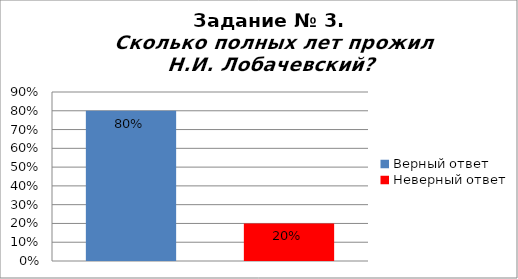
| Category | Сколько полных лет прожил Н.И. Лобачевский? |
|---|---|
| Верный ответ | 0.8 |
| Неверный ответ | 0.2 |